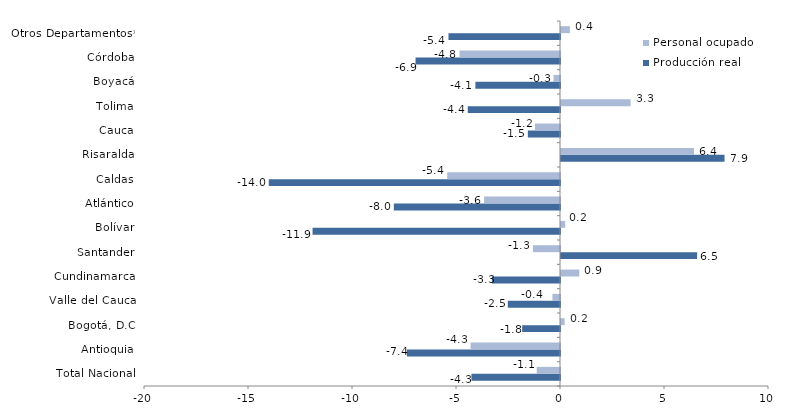
| Category | Producción real | Personal ocupado |
|---|---|---|
| Total Nacional | -4.257 | -1.119 |
| Antioquia | -7.363 | -4.298 |
| Bogotá, D.C | -1.819 | 0.176 |
| Valle del Cauca | -2.51 | -0.363 |
| Cundinamarca | -3.274 | 0.878 |
| Santander | 6.545 | -1.303 |
| Bolívar | -11.897 | 0.203 |
| Atlántico | -7.989 | -3.65 |
| Caldas | -14.002 | -5.423 |
| Risaralda | 7.863 | 6.398 |
| Cauca | -1.547 | -1.204 |
| Tolima | -4.435 | 3.347 |
| Boyacá | -4.067 | -0.311 |
| Córdoba | -6.946 | -4.832 |
| Otros Departamentos* | -5.362 | 0.427 |